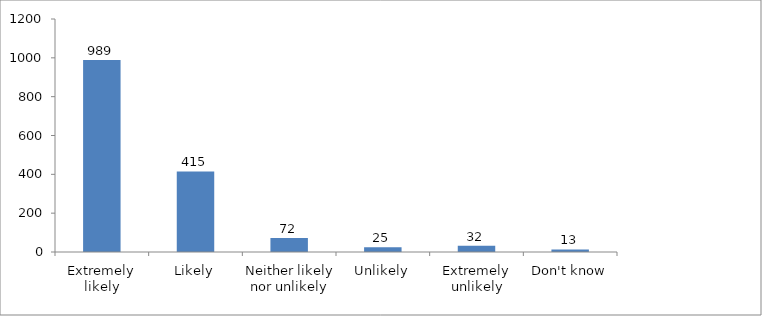
| Category | Series 0 |
|---|---|
| Extremely likely | 989 |
| Likely | 415 |
| Neither likely nor unlikely | 72 |
| Unlikely | 25 |
| Extremely unlikely | 32 |
| Don't know | 13 |